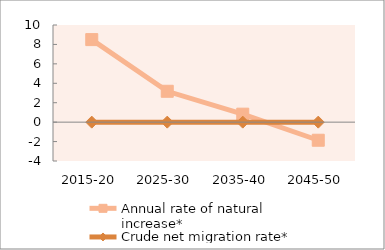
| Category | Annual rate of natural increase* | Crude net migration rate* |
|---|---|---|
| 2015-20 | 8.497 | 0 |
| 2025-30 | 3.177 | 0 |
| 2035-40 | 0.822 | 0 |
| 2045-50 | -1.863 | 0 |